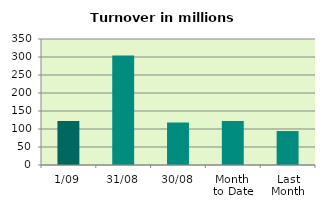
| Category | Series 0 |
|---|---|
| 1/09 | 122.314 |
| 31/08 | 303.997 |
| 30/08 | 118.27 |
| Month 
to Date | 122.314 |
| Last
Month | 94.334 |